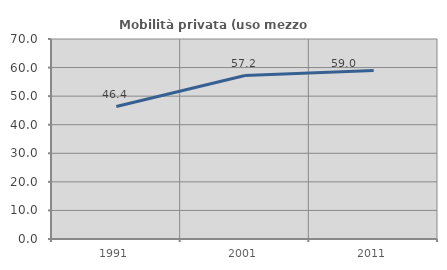
| Category | Mobilità privata (uso mezzo privato) |
|---|---|
| 1991.0 | 46.37 |
| 2001.0 | 57.213 |
| 2011.0 | 59.005 |